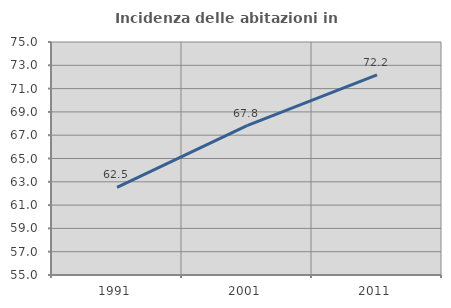
| Category | Incidenza delle abitazioni in proprietà  |
|---|---|
| 1991.0 | 62.524 |
| 2001.0 | 67.814 |
| 2011.0 | 72.177 |